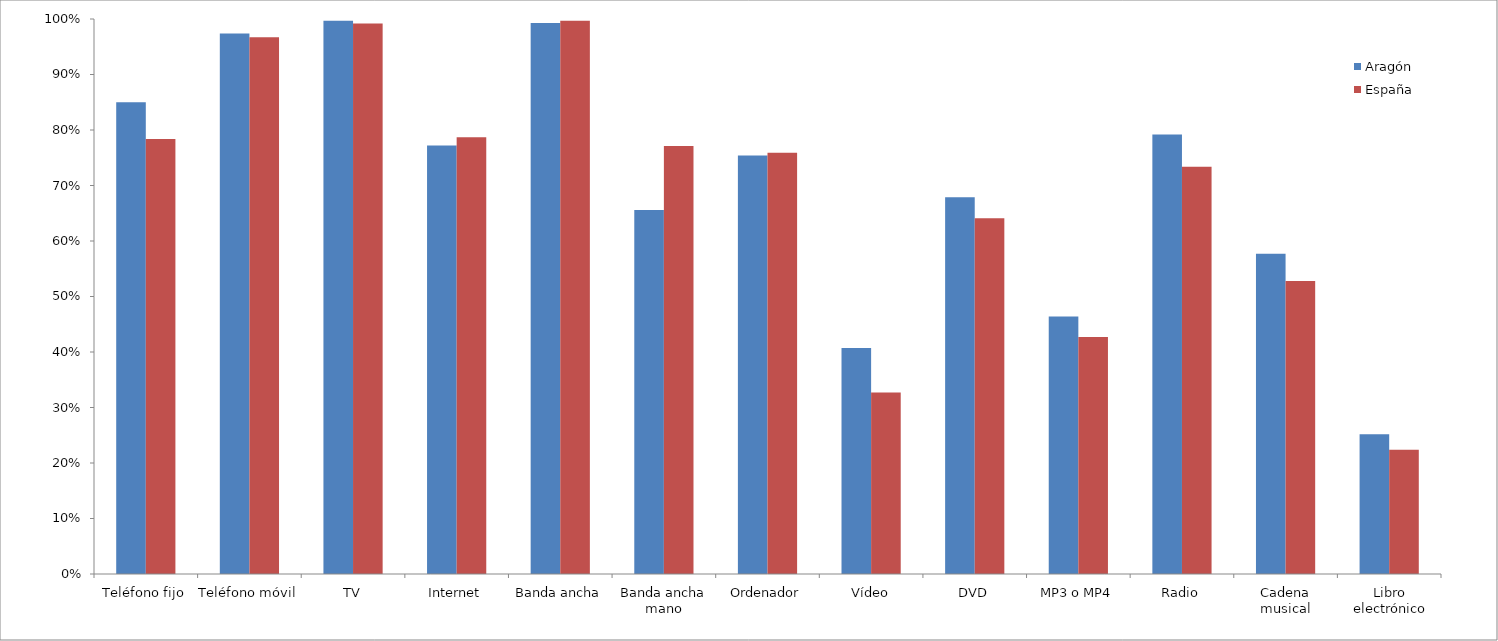
| Category | Aragón | España |
|---|---|---|
| Teléfono fijo | 0.85 | 0.784 |
| Teléfono móvil | 0.974 | 0.967 |
| TV | 0.997 | 0.992 |
| Internet | 0.772 | 0.787 |
| Banda ancha | 0.993 | 0.997 |
| Banda ancha mano | 0.656 | 0.771 |
| Ordenador | 0.754 | 0.759 |
| Vídeo | 0.407 | 0.327 |
| DVD | 0.679 | 0.641 |
| MP3 o MP4 | 0.464 | 0.427 |
| Radio | 0.792 | 0.734 |
| Cadena musical | 0.577 | 0.528 |
| Libro electrónico | 0.252 | 0.224 |